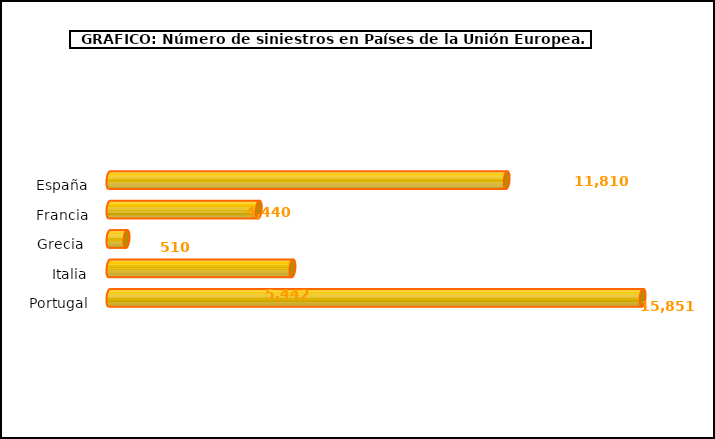
| Category | europa |
|---|---|
| España | 11810 |
| Francia | 4440 |
| Grecia  | 510 |
| Italia | 5442 |
| Portugal | 15851 |